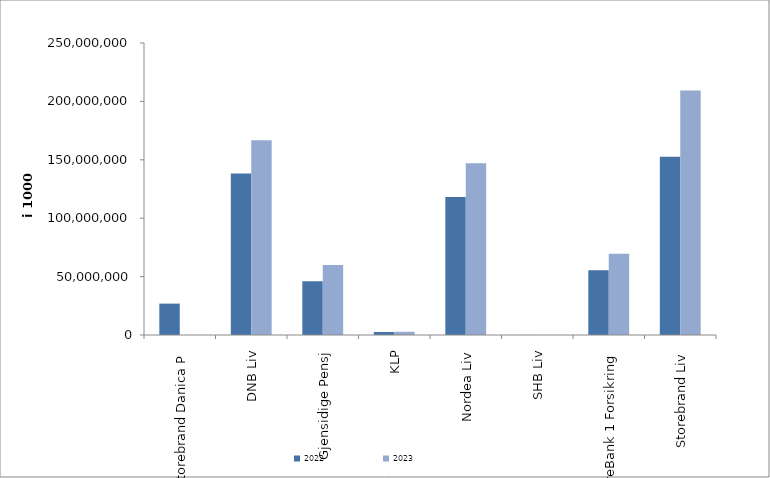
| Category | 2022 | 2023 |
|---|---|---|
| Storebrand Danica P | 26879329.206 | 0 |
| DNB Liv | 138259318.398 | 166722259.954 |
| Gjensidige Pensj | 45973809 | 59855898 |
| KLP | 2551713.405 | 2769122.959 |
| Nordea Liv | 118066460 | 147002430 |
| SHB Liv | 59412 | 0 |
| SpareBank 1 Forsikring | 55379613 | 69619506.747 |
| Storebrand Liv | 152581635.262 | 209344698.428 |